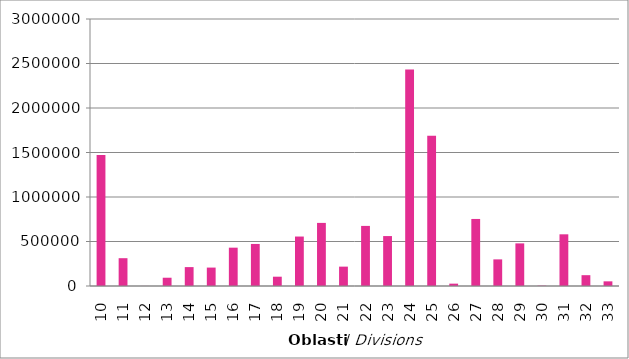
| Category | Series 0 |
|---|---|
| 10 | 1473144 |
| 11 | 312437 |
| 12 | 675 |
| 13 | 92944 |
| 14 | 212374 |
| 15 | 206978 |
| 16 | 430657 |
| 17 | 472411 |
| 18 | 104496 |
| 19 | 555775 |
| 20 | 708948 |
| 21 | 217619 |
| 22 | 675156 |
| 23 | 561007 |
| 24 | 2432898 |
| 25 | 1687771 |
| 26 | 26348 |
| 27 | 753259 |
| 28 | 299128 |
| 29 | 478862 |
| 30 | 3716 |
| 31 | 580766 |
| 32 | 121579 |
| 33 | 52368 |